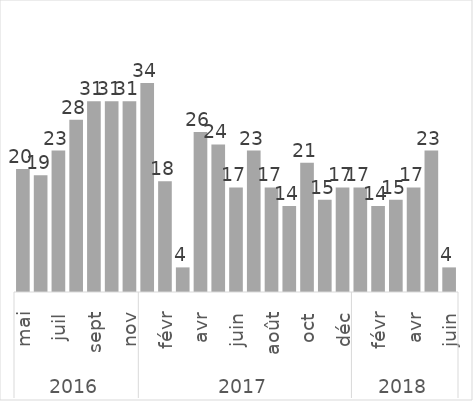
| Category | Total |
|---|---|
| 0 | 20 |
| 1 | 19 |
| 2 | 23 |
| 3 | 28 |
| 4 | 31 |
| 5 | 31 |
| 6 | 31 |
| 7 | 34 |
| 8 | 18 |
| 9 | 4 |
| 10 | 26 |
| 11 | 24 |
| 12 | 17 |
| 13 | 23 |
| 14 | 17 |
| 15 | 14 |
| 16 | 21 |
| 17 | 15 |
| 18 | 17 |
| 19 | 17 |
| 20 | 14 |
| 21 | 15 |
| 22 | 17 |
| 23 | 23 |
| 24 | 4 |